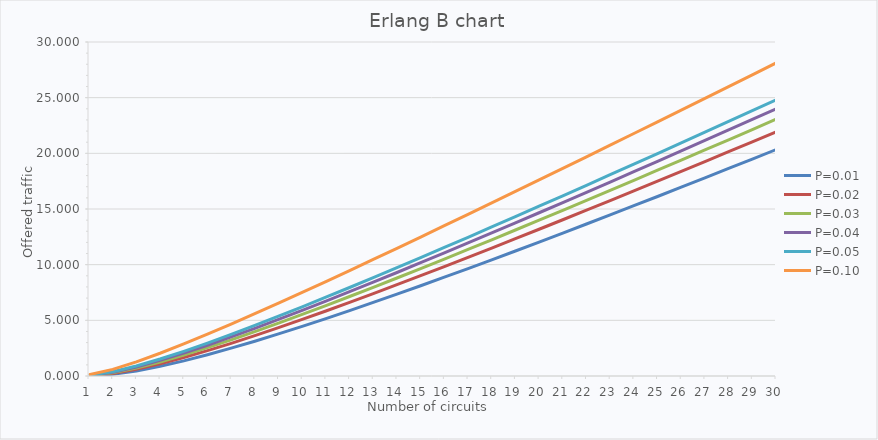
| Category | P=0.01 | P=0.02 | P=0.03 | P=0.04 | P=0.05 | P=0.10 |
|---|---|---|---|---|---|---|
| 1.0 | 0.01 | 0.02 | 0.031 | 0.042 | 0.053 | 0.111 |
| 2.0 | 0.153 | 0.223 | 0.281 | 0.333 | 0.381 | 0.595 |
| 3.0 | 0.455 | 0.602 | 0.715 | 0.812 | 0.899 | 1.271 |
| 4.0 | 0.869 | 1.092 | 1.259 | 1.399 | 1.524 | 2.045 |
| 5.0 | 1.36 | 1.657 | 1.875 | 2.057 | 2.218 | 2.881 |
| 6.0 | 1.909 | 2.276 | 2.543 | 2.764 | 2.96 | 3.757 |
| 7.0 | 2.501 | 2.935 | 3.25 | 3.509 | 3.738 | 4.666 |
| 8.0 | 3.127 | 3.627 | 3.986 | 4.282 | 4.542 | 5.596 |
| 9.0 | 3.782 | 4.344 | 4.747 | 5.079 | 5.37 | 6.546 |
| 10.0 | 4.46 | 5.083 | 5.529 | 5.895 | 6.215 | 7.51 |
| 11.0 | 5.16 | 5.841 | 6.327 | 6.726 | 7.075 | 8.486 |
| 12.0 | 5.875 | 6.614 | 7.14 | 7.572 | 7.95 | 9.472 |
| 13.0 | 6.606 | 7.401 | 7.966 | 8.43 | 8.834 | 10.467 |
| 14.0 | 7.351 | 8.2 | 8.803 | 9.297 | 9.728 | 11.471 |
| 15.0 | 8.108 | 9.009 | 9.65 | 10.173 | 10.631 | 12.482 |
| 16.0 | 8.875 | 9.828 | 10.504 | 11.059 | 11.543 | 13.5 |
| 17.0 | 9.651 | 10.655 | 11.368 | 11.951 | 12.459 | 14.518 |
| 18.0 | 10.436 | 11.49 | 12.237 | 12.85 | 13.384 | 15.548 |
| 19.0 | 11.229 | 12.332 | 13.114 | 13.754 | 14.313 | 16.579 |
| 20.0 | 12.03 | 13.181 | 13.997 | 14.663 | 15.249 | 17.612 |
| 21.0 | 12.837 | 14.035 | 14.884 | 15.578 | 16.186 | 18.649 |
| 22.0 | 13.651 | 14.894 | 15.778 | 16.5 | 17.131 | 19.69 |
| 23.0 | 14.469 | 15.759 | 16.674 | 17.424 | 18.078 | 20.734 |
| 24.0 | 15.294 | 16.629 | 17.575 | 18.352 | 19.028 | 21.779 |
| 25.0 | 16.124 | 17.503 | 18.481 | 19.284 | 19.983 | 22.83 |
| 26.0 | 16.958 | 18.381 | 19.392 | 20.217 | 20.941 | 23.88 |
| 27.0 | 17.796 | 19.265 | 20.303 | 21.156 | 21.901 | 24.937 |
| 28.0 | 18.64 | 20.149 | 21.219 | 22.097 | 22.866 | 25.99 |
| 29.0 | 19.486 | 21.038 | 22.139 | 23.042 | 23.832 | 27.049 |
| 30.0 | 20.336 | 21.931 | 23.06 | 23.987 | 24.8 | 28.11 |